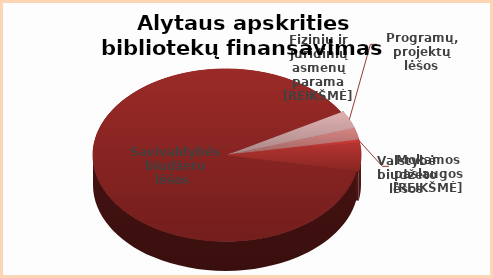
| Category | Series 0 |
|---|---|
| Programų | 3.3 |
| Parama | 2.2 |
| Paslaugos | 0.5 |
| Valstybės | 5.3 |
| Savivaldybės | 88.7 |